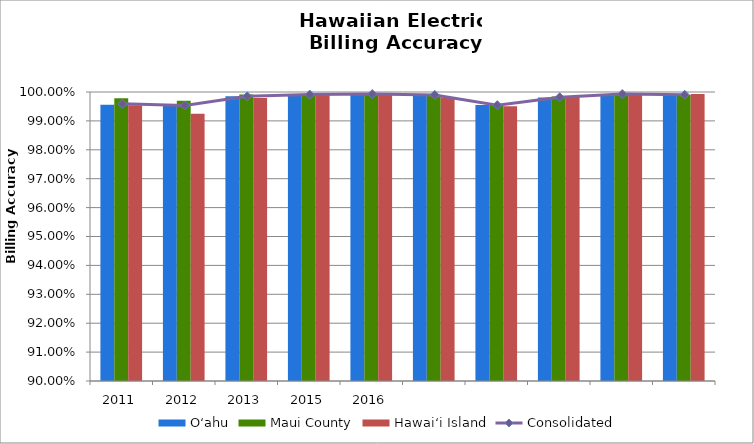
| Category | O‘ahu | Maui County | Hawai‘i Island |
|---|---|---|---|
| 2011.0 | 0.996 | 0.998 | 0.995 |
| 2012.0 | 0.996 | 0.997 | 0.992 |
| 2013.0 | 0.998 | 0.999 | 0.998 |
| 2015.0 | 0.999 | 0.999 | 0.999 |
| 2016.0 | 0.999 | 0.999 | 0.999 |